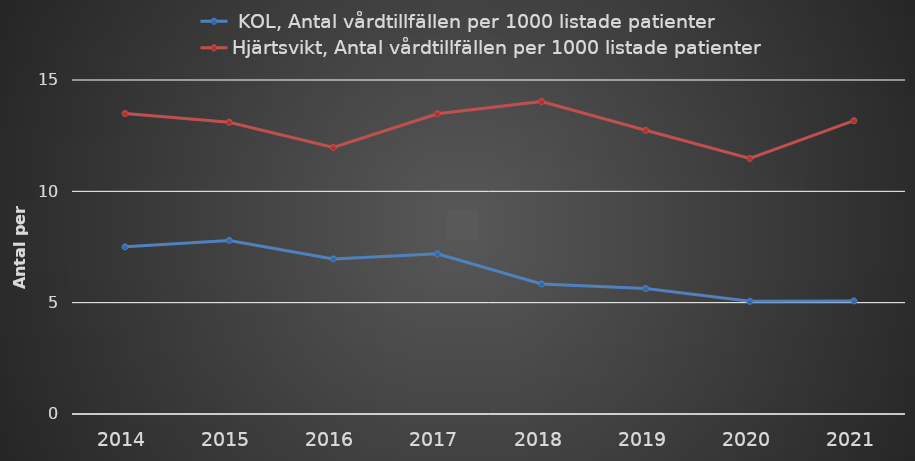
| Category |  KOL, Antal vårdtillfällen per 1000 listade patienter | Hjärtsvikt, Antal vårdtillfällen per 1000 listade patienter |
|---|---|---|
| 2014 | 7.507 | 13.494 |
| 2015 | 7.795 | 13.104 |
| 2016 | 6.966 | 11.974 |
| 2017 | 7.193 | 13.484 |
| 2018 | 5.838 | 14.037 |
| 2019 | 5.636 | 12.742 |
| 2020 | 5.06 | 11.477 |
| 2021 | 5.078 | 13.172 |